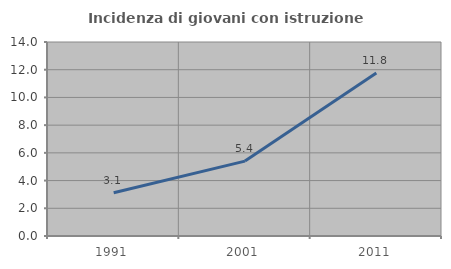
| Category | Incidenza di giovani con istruzione universitaria |
|---|---|
| 1991.0 | 3.125 |
| 2001.0 | 5.405 |
| 2011.0 | 11.765 |